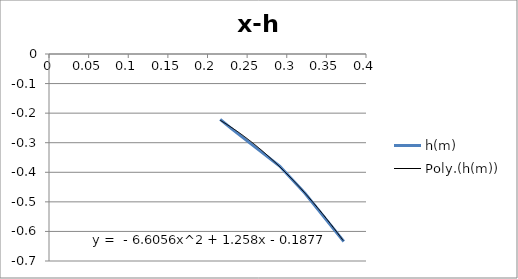
| Category | h(m) |
|---|---|
| 0.216 | -0.221 |
| 0.231 | -0.254 |
| 0.291 | -0.379 |
| 0.323 | -0.471 |
| 0.372 | -0.634 |